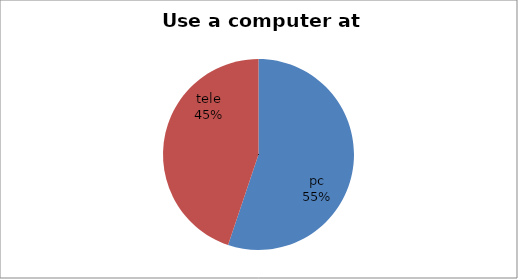
| Category | Series 0 |
|---|---|
| pc | 203 |
| tele | 165 |